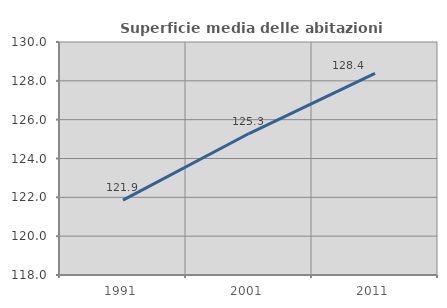
| Category | Superficie media delle abitazioni occupate |
|---|---|
| 1991.0 | 121.855 |
| 2001.0 | 125.286 |
| 2011.0 | 128.383 |